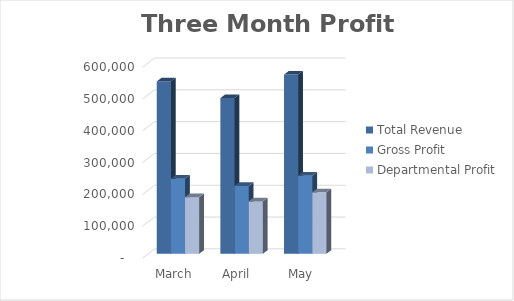
| Category | Total Revenue | Gross Profit | Departmental Profit |
|---|---|---|---|
| 2019-03-31 | 542166.58 | 236031.3 | 178191.59 |
| 2019-04-30 | 489657.68 | 213531.35 | 164797.89 |
| 2019-05-31 | 563408.44 | 245850.61 | 193340.49 |